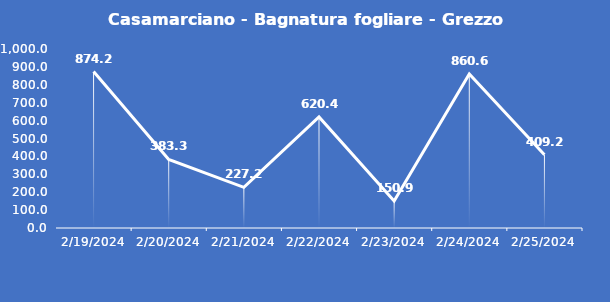
| Category | Casamarciano - Bagnatura fogliare - Grezzo (min) |
|---|---|
| 2/19/24 | 874.2 |
| 2/20/24 | 383.3 |
| 2/21/24 | 227.2 |
| 2/22/24 | 620.4 |
| 2/23/24 | 150.9 |
| 2/24/24 | 860.6 |
| 2/25/24 | 409.2 |